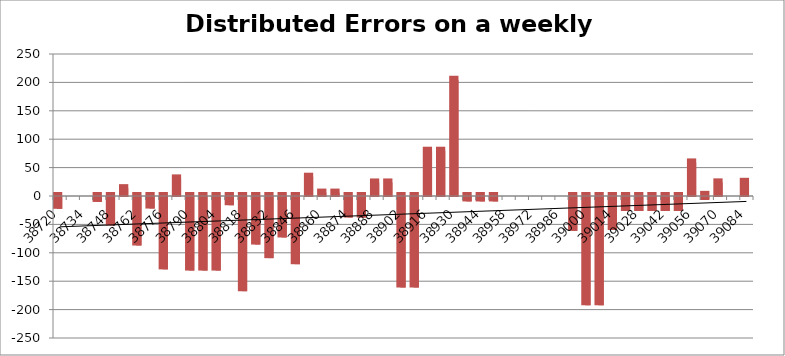
| Category | Distributed Errors on a weekly basis |
|---|---|
| 38720.0 | -20.76 |
| 38727.0 | 0 |
| 38734.0 | 0 |
| 38741.0 | -8.71 |
| 38748.0 | -50.14 |
| 38755.0 | 13.82 |
| 38762.0 | -85.38 |
| 38769.0 | -20.32 |
| 38776.0 | -127.42 |
| 38783.0 | 31 |
| 38790.0 | -129.5 |
| 38797.0 | -129.5 |
| 38804.0 | -129.5 |
| 38811.0 | -14.53 |
| 38818.0 | -165.83 |
| 38825.0 | -83.7 |
| 38832.0 | -107.65 |
| 38839.0 | -71.25 |
| 38846.0 | -118.34 |
| 38853.0 | 33.97 |
| 38860.0 | 6.015 |
| 38867.0 | 6.015 |
| 38874.0 | -36.135 |
| 38881.0 | -36.135 |
| 38888.0 | 23.86 |
| 38895.0 | 23.86 |
| 38902.0 | -159.345 |
| 38909.0 | -159.345 |
| 38916.0 | 79.72 |
| 38923.0 | 79.72 |
| 38930.0 | 204.46 |
| 38937.0 | -7.837 |
| 38944.0 | -7.837 |
| 38951.0 | -7.837 |
| 38958.0 | 0 |
| 38965.0 | 0 |
| 38972.0 | 0 |
| 38979.0 | 0 |
| 38986.0 | 0 |
| 38993.0 | -59.57 |
| 39000.0 | -190.69 |
| 39007.0 | -190.69 |
| 39014.0 | -58.11 |
| 39021.0 | -24.688 |
| 39028.0 | -24.688 |
| 39035.0 | -24.688 |
| 39042.0 | -24.688 |
| 39049.0 | -24.688 |
| 39056.0 | 59.12 |
| 39063.0 | -3.27 |
| 39070.0 | 24 |
| 39077.0 | 0 |
| 39084.0 | 25 |